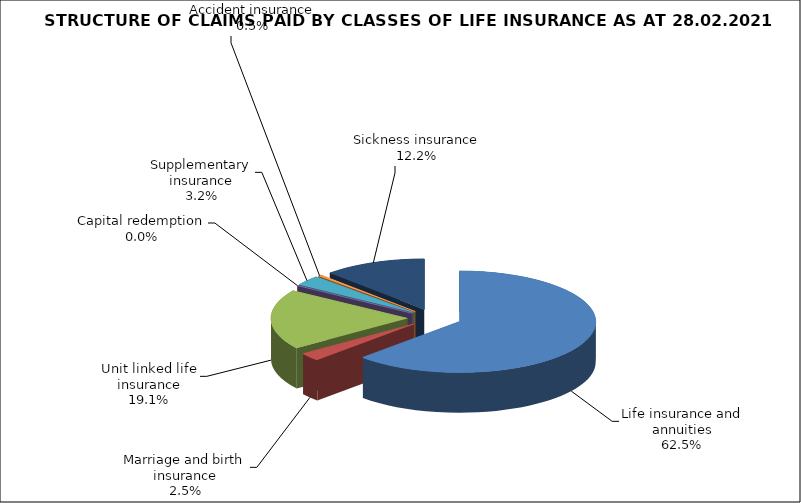
| Category | 24 121 238 |
|---|---|
| Life insurance and annuities | 24121237.83 |
| Marriage and birth insurance | 979720.985 |
| Unit linked life insurance | 7377747.59 |
| Capital redemption | 0 |
| Supplementary insurance | 1234059.931 |
| Accident insurance | 174288.222 |
| Sickness insurance | 4699253.973 |